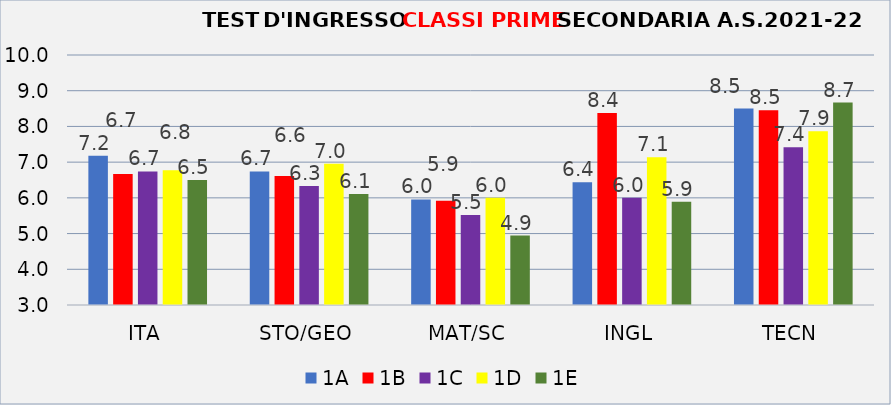
| Category | 1A | 1B | 1C | 1D | 1E |
|---|---|---|---|---|---|
| ITA | 7.182 | 6.667 | 6.739 | 6.773 | 6.5 |
| STO/GEO | 6.739 | 6.609 | 6.333 | 6.957 | 6.111 |
| MAT/SC | 5.957 | 5.917 | 5.522 | 6 | 4.944 |
| INGL | 6.435 | 8.375 | 6 | 7.136 | 5.889 |
| TECN | 8.5 | 8.45 | 7.417 | 7.864 | 8.667 |